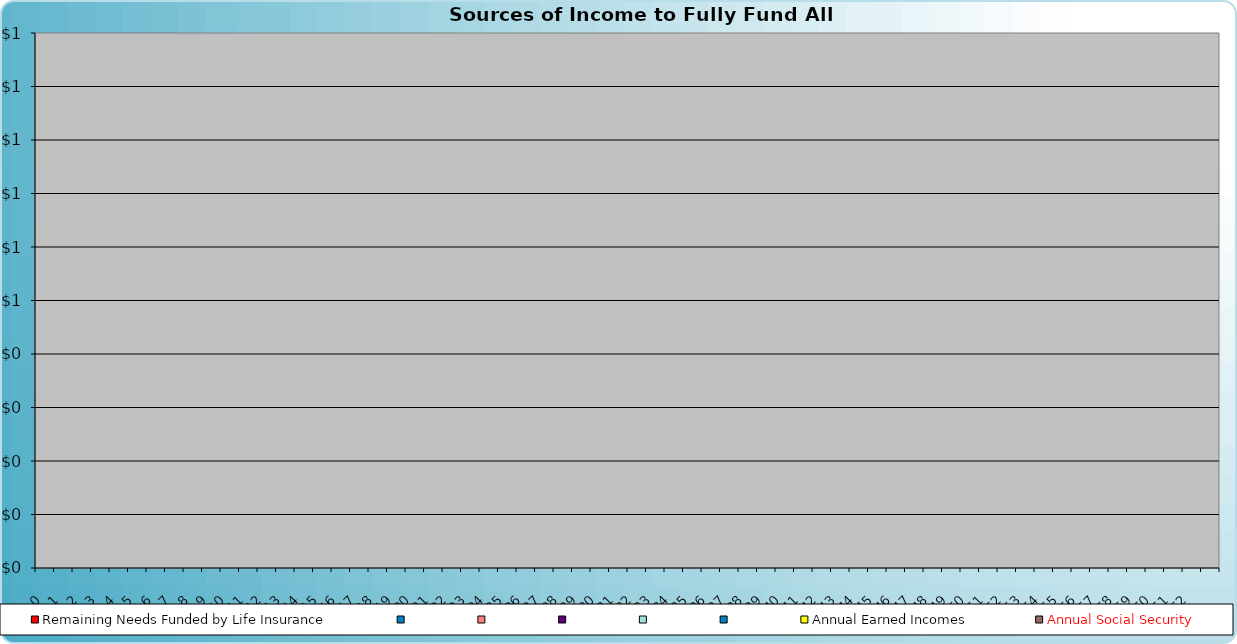
| Category | Annual Social Security | Annual Earned Incomes |   | Remaining Needs Funded by Life Insurance |
|---|---|---|---|---|
| 0.0 | 0 | 0 | 0 | 0 |
| 1.0 | 0 | 0 | 0 | 0 |
| 2.0 | 0 | 0 | 0 | 0 |
| 3.0 | 0 | 0 | 0 | 0 |
| 4.0 | 0 | 0 | 0 | 0 |
| 5.0 | 0 | 0 | 0 | 0 |
| 6.0 | 0 | 0 | 0 | 0 |
| 7.0 | 0 | 0 | 0 | 0 |
| 8.0 | 0 | 0 | 0 | 0 |
| 9.0 | 0 | 0 | 0 | 0 |
| 10.0 | 0 | 0 | 0 | 0 |
| 11.0 | 0 | 0 | 0 | 0 |
| 12.0 | 0 | 0 | 0 | 0 |
| 13.0 | 0 | 0 | 0 | 0 |
| 14.0 | 0 | 0 | 0 | 0 |
| 15.0 | 0 | 0 | 0 | 0 |
| 16.0 | 0 | 0 | 0 | 0 |
| 17.0 | 0 | 0 | 0 | 0 |
| 18.0 | 0 | 0 | 0 | 0 |
| 19.0 | 0 | 0 | 0 | 0 |
| 20.0 | 0 | 0 | 0 | 0 |
| 21.0 | 0 | 0 | 0 | 0 |
| 22.0 | 0 | 0 | 0 | 0 |
| 23.0 | 0 | 0 | 0 | 0 |
| 24.0 | 0 | 0 | 0 | 0 |
| 25.0 | 0 | 0 | 0 | 0 |
| 26.0 | 0 | 0 | 0 | 0 |
| 27.0 | 0 | 0 | 0 | 0 |
| 28.0 | 0 | 0 | 0 | 0 |
| 29.0 | 0 | 0 | 0 | 0 |
| 30.0 | 0 | 0 | 0 | 0 |
| 31.0 | 0 | 0 | 0 | 0 |
| 32.0 | 0 | 0 | 0 | 0 |
| 33.0 | 0 | 0 | 0 | 0 |
| 34.0 | 0 | 0 | 0 | 0 |
| 35.0 | 0 | 0 | 0 | 0 |
| 36.0 | 0 | 0 | 0 | 0 |
| 37.0 | 0 | 0 | 0 | 0 |
| 38.0 | 0 | 0 | 0 | 0 |
| 39.0 | 0 | 0 | 0 | 0 |
| 40.0 | 0 | 0 | 0 | 0 |
| 41.0 | 0 | 0 | 0 | 0 |
| 42.0 | 0 | 0 | 0 | 0 |
| 43.0 | 0 | 0 | 0 | 0 |
| 44.0 | 0 | 0 | 0 | 0 |
| 45.0 | 0 | 0 | 0 | 0 |
| 46.0 | 0 | 0 | 0 | 0 |
| 47.0 | 0 | 0 | 0 | 0 |
| 48.0 | 0 | 0 | 0 | 0 |
| 49.0 | 0 | 0 | 0 | 0 |
| 50.0 | 0 | 0 | 0 | 0 |
| 51.0 | 0 | 0 | 0 | 0 |
| 52.0 | 0 | 0 | 0 | 0 |
| 53.0 | 0 | 0 | 0 | 0 |
| 54.0 | 0 | 0 | 0 | 0 |
| 55.0 | 0 | 0 | 0 | 0 |
| 56.0 | 0 | 0 | 0 | 0 |
| 57.0 | 0 | 0 | 0 | 0 |
| 58.0 | 0 | 0 | 0 | 0 |
| 59.0 | 0 | 0 | 0 | 0 |
| 60.0 | 0 | 0 | 0 | 0 |
| 61.0 | 0 | 0 | 0 | 0 |
| 62.0 | 0 | 0 | 0 | 0 |